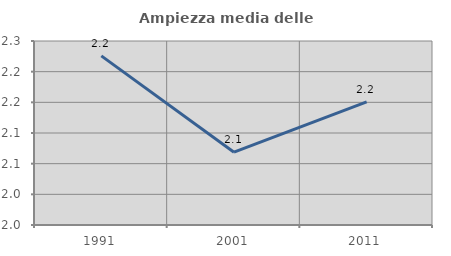
| Category | Ampiezza media delle famiglie |
|---|---|
| 1991.0 | 2.226 |
| 2001.0 | 2.069 |
| 2011.0 | 2.151 |